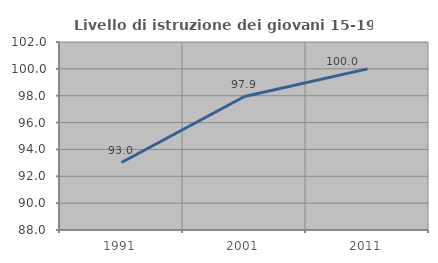
| Category | Livello di istruzione dei giovani 15-19 anni |
|---|---|
| 1991.0 | 93.023 |
| 2001.0 | 97.938 |
| 2011.0 | 100 |